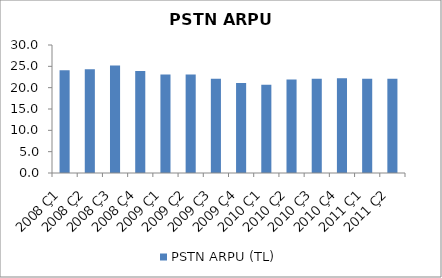
| Category | PSTN ARPU (TL) |
|---|---|
| 2008 Ç1 | 24.1 |
| 2008 Ç2 | 24.3 |
| 2008 Ç3 | 25.2 |
| 2008 Ç4 | 23.9 |
| 2009 Ç1 | 23.1 |
| 2009 Ç2 | 23.1 |
| 2009 Ç3 | 22.1 |
| 2009 Ç4 | 21.1 |
| 2010 Ç1 | 20.7 |
| 2010 Ç2 | 21.9 |
| 2010 Ç3 | 22.1 |
| 2010 Ç4 | 22.2 |
| 2011 Ç1 | 22.1 |
| 2011 Ç2 | 22.1 |